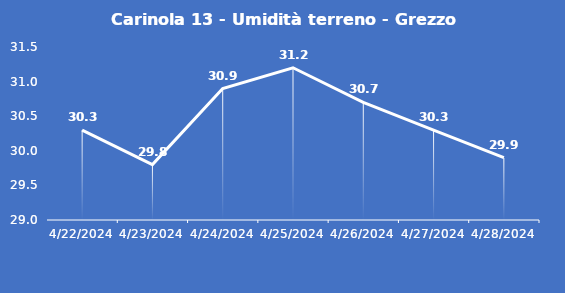
| Category | Carinola 13 - Umidità terreno - Grezzo (%VWC) |
|---|---|
| 4/22/24 | 30.3 |
| 4/23/24 | 29.8 |
| 4/24/24 | 30.9 |
| 4/25/24 | 31.2 |
| 4/26/24 | 30.7 |
| 4/27/24 | 30.3 |
| 4/28/24 | 29.9 |